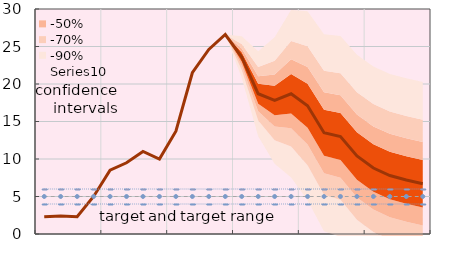
| Category | Series 8 | Series 10 | Series 11 | Series 12 |
|---|---|---|---|---|
|  | 2.3 | 4 | 5 | 6 |
|  | 2.4 | 4 | 5 | 6 |
|  | 2.3 | 4 | 5 | 6 |
| IV.20 | 5 | 4 | 5 | 6 |
|  | 8.5 | 4 | 5 | 6 |
|  | 9.5 | 4 | 5 | 6 |
|  | 11 | 4 | 5 | 6 |
| IV.21 | 10 | 4 | 5 | 6 |
|  | 13.7 | 4 | 5 | 6 |
|  | 21.5 | 4 | 5 | 6 |
|  | 24.6 | 4 | 5 | 6 |
| IV.22 | 26.6 | 4 | 5 | 6 |
|  | 23.6 | 4 | 5 | 6 |
|  | 18.7 | 4 | 5 | 6 |
|  | 17.8 | 4 | 5 | 6 |
| IV.23 | 18.7 | 4 | 5 | 6 |
|  | 17.1 | 4 | 5 | 6 |
|  | 13.5 | 4 | 5 | 6 |
|  | 13 | 4 | 5 | 6 |
| IV.24 | 10.4 | 4 | 5 | 6 |
|  | 8.8 | 4 | 5 | 6 |
|  | 7.8 | 4 | 5 | 6 |
|  | 7.2 | 4 | 5 | 6 |
| IV.25 | 6.7 | 4 | 5 | 6 |